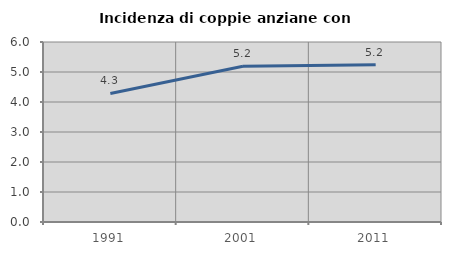
| Category | Incidenza di coppie anziane con figli |
|---|---|
| 1991.0 | 4.286 |
| 2001.0 | 5.189 |
| 2011.0 | 5.242 |